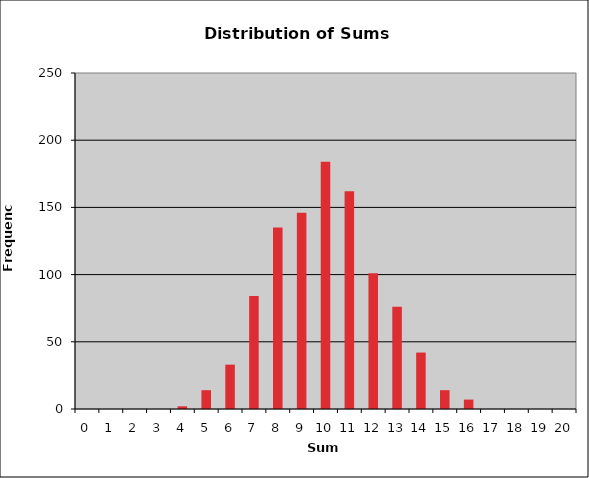
| Category | Series 1 |
|---|---|
| 0.0 | 0 |
| 1.0 | 0 |
| 2.0 | 0 |
| 3.0 | 0 |
| 4.0 | 2 |
| 5.0 | 14 |
| 6.0 | 33 |
| 7.0 | 84 |
| 8.0 | 135 |
| 9.0 | 146 |
| 10.0 | 184 |
| 11.0 | 162 |
| 12.0 | 101 |
| 13.0 | 76 |
| 14.0 | 42 |
| 15.0 | 14 |
| 16.0 | 7 |
| 17.0 | 0 |
| 18.0 | 0 |
| 19.0 | 0 |
| 20.0 | 0 |